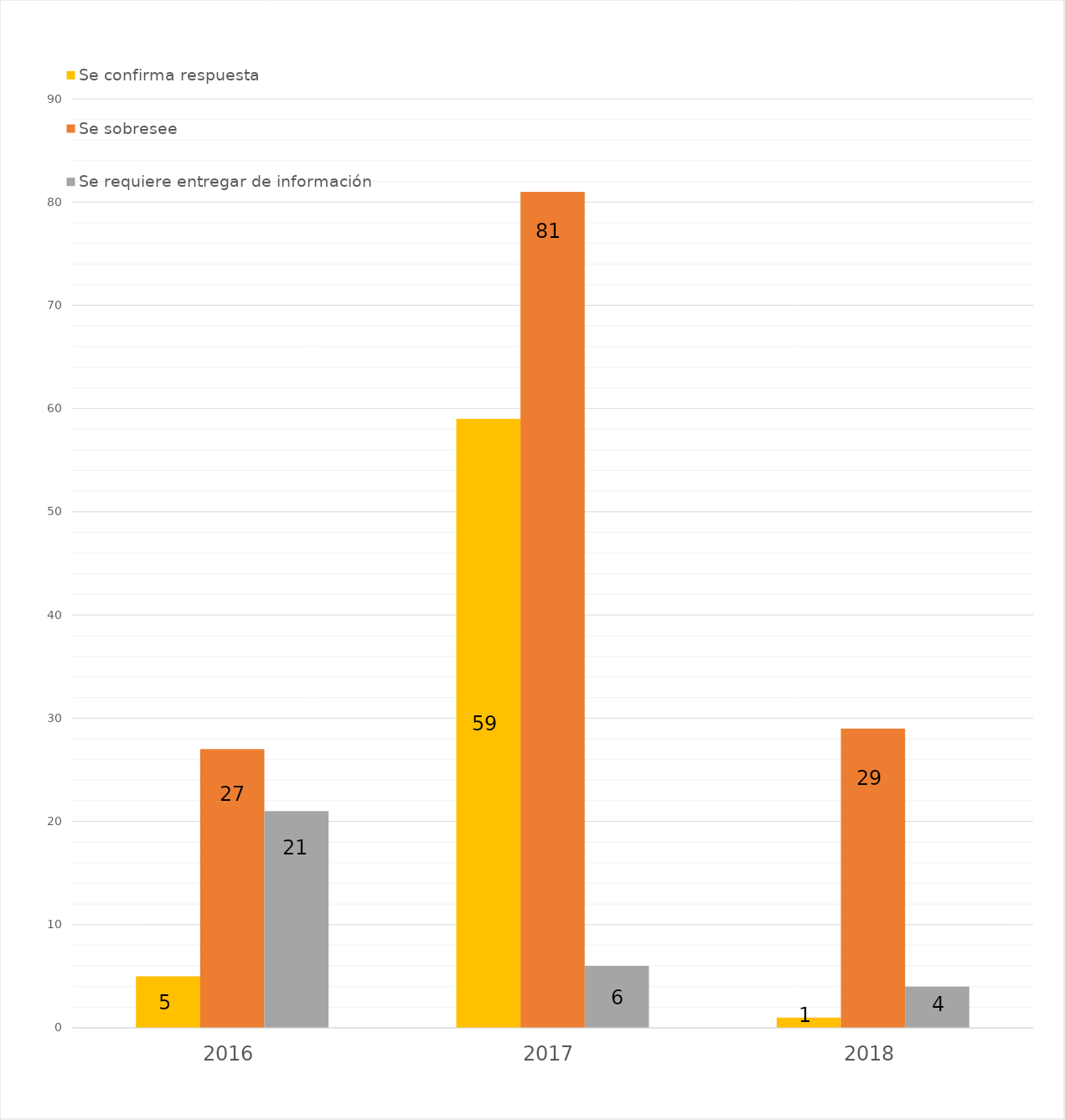
| Category | Se confirma respuesta | Se sobresee  | Se requiere entregar de información  |
|---|---|---|---|
| 2016.0 | 5 | 27 | 21 |
| 2017.0 | 59 | 81 | 6 |
| 2018.0 | 1 | 29 | 4 |